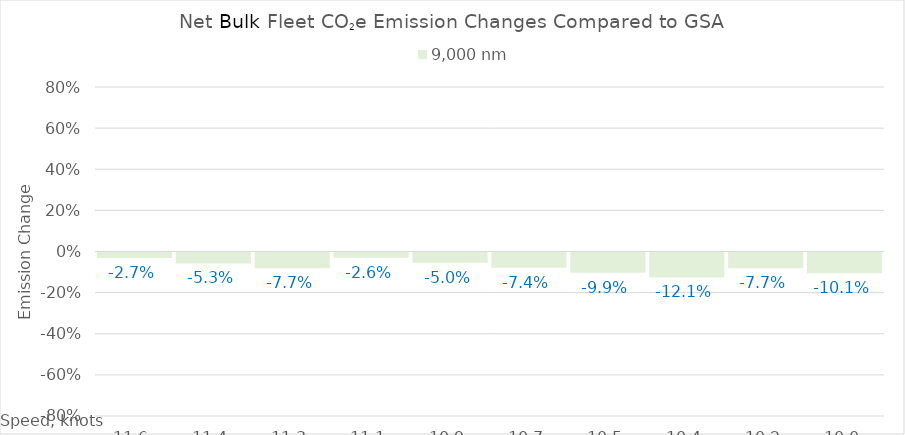
| Category | 9,000 |
|---|---|
| 11.620000000000001 | -0.027 |
| 11.440000000000001 | -0.053 |
| 11.260000000000002 | -0.077 |
| 11.080000000000002 | -0.026 |
| 10.900000000000002 | -0.05 |
| 10.720000000000002 | -0.074 |
| 10.540000000000003 | -0.099 |
| 10.360000000000003 | -0.121 |
| 10.180000000000003 | -0.077 |
| 10.000000000000004 | -0.101 |